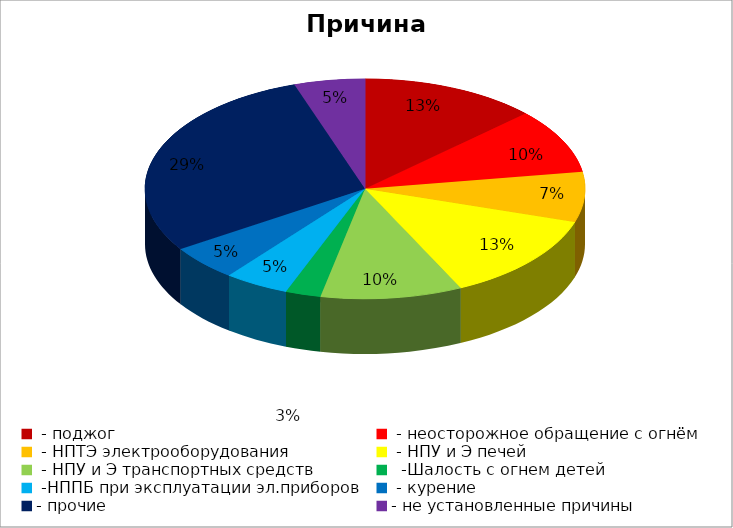
| Category | Причина пожара |
|---|---|
|  - поджог | 30 |
|  - неосторожное обращение с огнём | 22 |
|  - НПТЭ электрооборудования | 17 |
|  - НПУ и Э печей | 30 |
|  - НПУ и Э транспортных средств | 24 |
|   -Шалость с огнем детей | 6 |
|  -НППБ при эксплуатации эл.приборов | 11 |
|  - курение | 12 |
| - прочие | 67 |
| - не установленные причины | 12 |